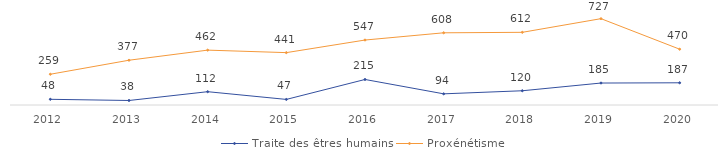
| Category | Traite des êtres humains | Proxénétisme |
|---|---|---|
| 2012 | 48 | 259 |
| 2013 | 38 | 377 |
| 2014 | 112 | 462 |
| 2015 | 47 | 441 |
| 2016 | 215 | 547 |
| 2017 | 94 | 608 |
| 2018 | 120 | 612 |
| 2019 | 185 | 727 |
| 2020 | 187 | 470 |